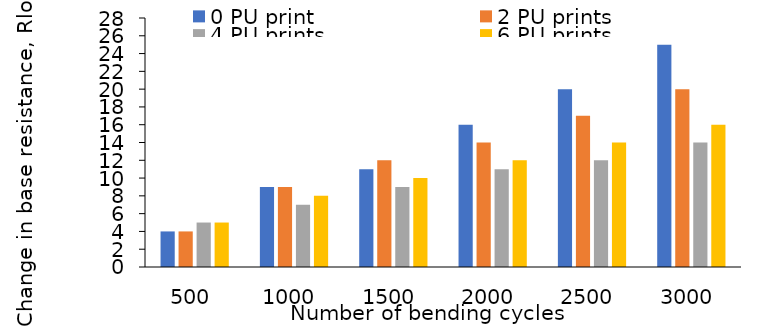
| Category | 0 PU print | 2 PU prints | 4 PU prints | 6 PU prints |
|---|---|---|---|---|
| 500.0 | 4 | 4 | 5 | 5 |
| 1000.0 | 9 | 9 | 7 | 8 |
| 1500.0 | 11 | 12 | 9 | 10 |
| 2000.0 | 16 | 14 | 11 | 12 |
| 2500.0 | 20 | 17 | 12 | 14 |
| 3000.0 | 25 | 20 | 14 | 16 |